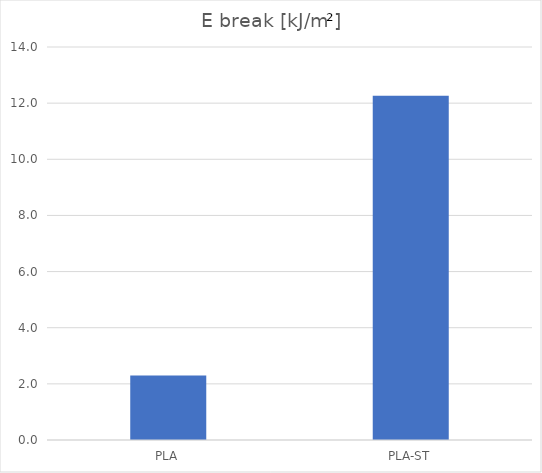
| Category | kJ/m² |
|---|---|
| PLA | 2.299 |
| PLA-ST | 12.263 |